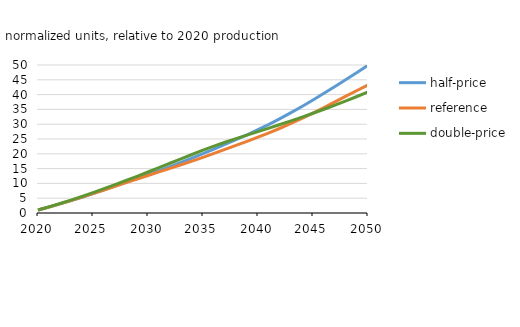
| Category | half-price | reference | double-price |
|---|---|---|---|
| 2020 | 0.996 | 1 | 1.02 |
| 2021 | 2.019 | 2.031 | 2.083 |
| 2022 | 3.078 | 3.097 | 3.195 |
| 2023 | 4.18 | 4.204 | 4.362 |
| 2024 | 5.34 | 5.359 | 5.597 |
| 2025 | 6.545 | 6.553 | 6.887 |
| 2026 | 7.796 | 7.77 | 8.22 |
| 2027 | 9.076 | 9.01 | 9.591 |
| 2028 | 10.359 | 10.246 | 10.987 |
| 2029 | 11.634 | 11.461 | 12.403 |
| 2030 | 12.933 | 12.675 | 13.851 |
| 2031 | 14.261 | 13.886 | 15.319 |
| 2032 | 15.647 | 15.1 | 16.812 |
| 2033 | 17.068 | 16.315 | 18.285 |
| 2034 | 18.534 | 17.543 | 19.762 |
| 2035 | 20.042 | 18.806 | 21.223 |
| 2036 | 21.581 | 20.133 | 22.61 |
| 2037 | 23.146 | 21.488 | 23.908 |
| 2038 | 24.749 | 22.852 | 25.142 |
| 2039 | 26.396 | 24.215 | 26.31 |
| 2040 | 28.132 | 25.63 | 27.495 |
| 2041 | 29.96 | 27.094 | 28.689 |
| 2042 | 31.882 | 28.63 | 29.908 |
| 2043 | 33.892 | 30.241 | 31.145 |
| 2044 | 35.989 | 31.946 | 32.414 |
| 2045 | 38.172 | 33.738 | 33.71 |
| 2046 | 40.446 | 35.607 | 35.059 |
| 2047 | 42.758 | 37.522 | 36.433 |
| 2048 | 45.093 | 39.461 | 37.867 |
| 2049 | 47.481 | 41.372 | 39.358 |
| 2050 | 49.92 | 43.264 | 40.918 |